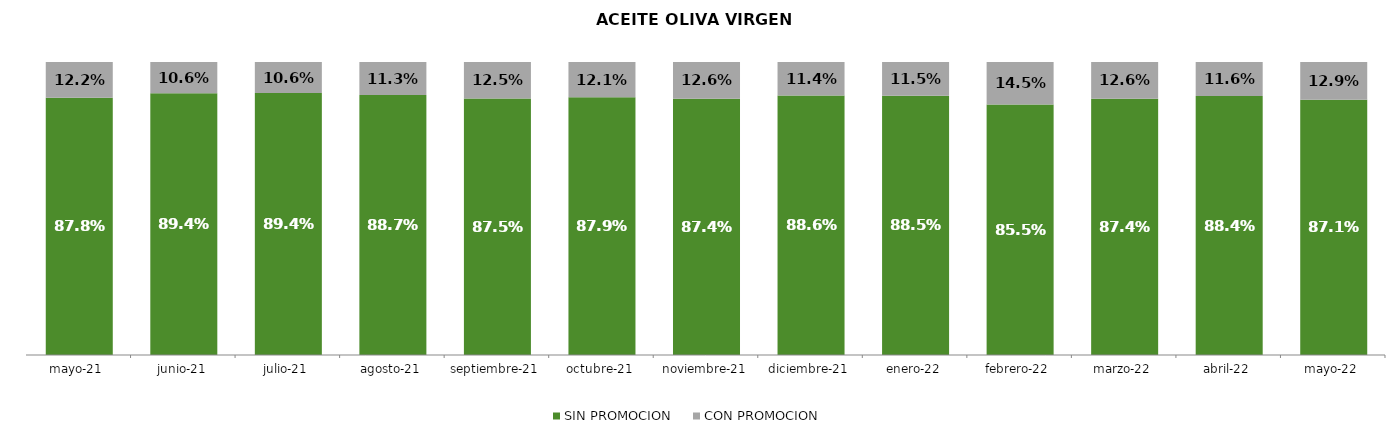
| Category | SIN PROMOCION   | CON PROMOCION   |
|---|---|---|
| 2021-05-01 | 0.878 | 0.122 |
| 2021-06-01 | 0.894 | 0.106 |
| 2021-07-01 | 0.894 | 0.106 |
| 2021-08-01 | 0.887 | 0.113 |
| 2021-09-01 | 0.875 | 0.125 |
| 2021-10-01 | 0.879 | 0.121 |
| 2021-11-01 | 0.874 | 0.126 |
| 2021-12-01 | 0.886 | 0.114 |
| 2022-01-01 | 0.885 | 0.115 |
| 2022-02-01 | 0.855 | 0.145 |
| 2022-03-01 | 0.874 | 0.126 |
| 2022-04-01 | 0.884 | 0.116 |
| 2022-05-01 | 0.871 | 0.129 |